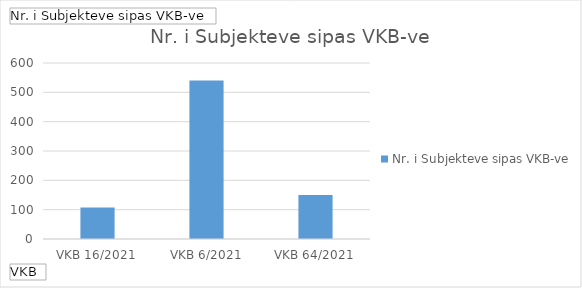
| Category | Totali |
|---|---|
| VKB 16/2021 | 107 |
| VKB 6/2021 | 540 |
| VKB 64/2021 | 150 |